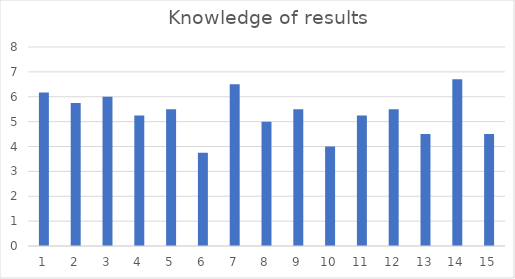
| Category | Knowledge of results |
|---|---|
| 0 | 6.17 |
| 1 | 5.75 |
| 2 | 6 |
| 3 | 5.25 |
| 4 | 5.5 |
| 5 | 3.75 |
| 6 | 6.5 |
| 7 | 5 |
| 8 | 5.5 |
| 9 | 4 |
| 10 | 5.25 |
| 11 | 5.5 |
| 12 | 4.5 |
| 13 | 6.7 |
| 14 | 4.5 |